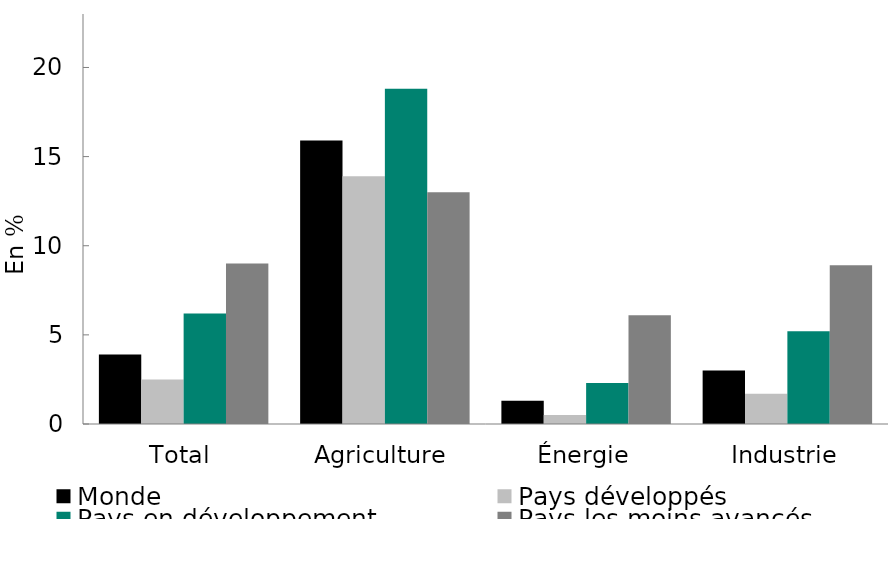
| Category | Monde | Pays développés | Pays en développement | Pays les moins avancés |
|---|---|---|---|---|
| Total | 3.9 | 2.5 | 6.2 | 9 |
| Agriculture | 15.9 | 13.9 | 18.8 | 13 |
| Énergie | 1.3 | 0.5 | 2.3 | 6.1 |
| Industrie | 3 | 1.7 | 5.2 | 8.9 |